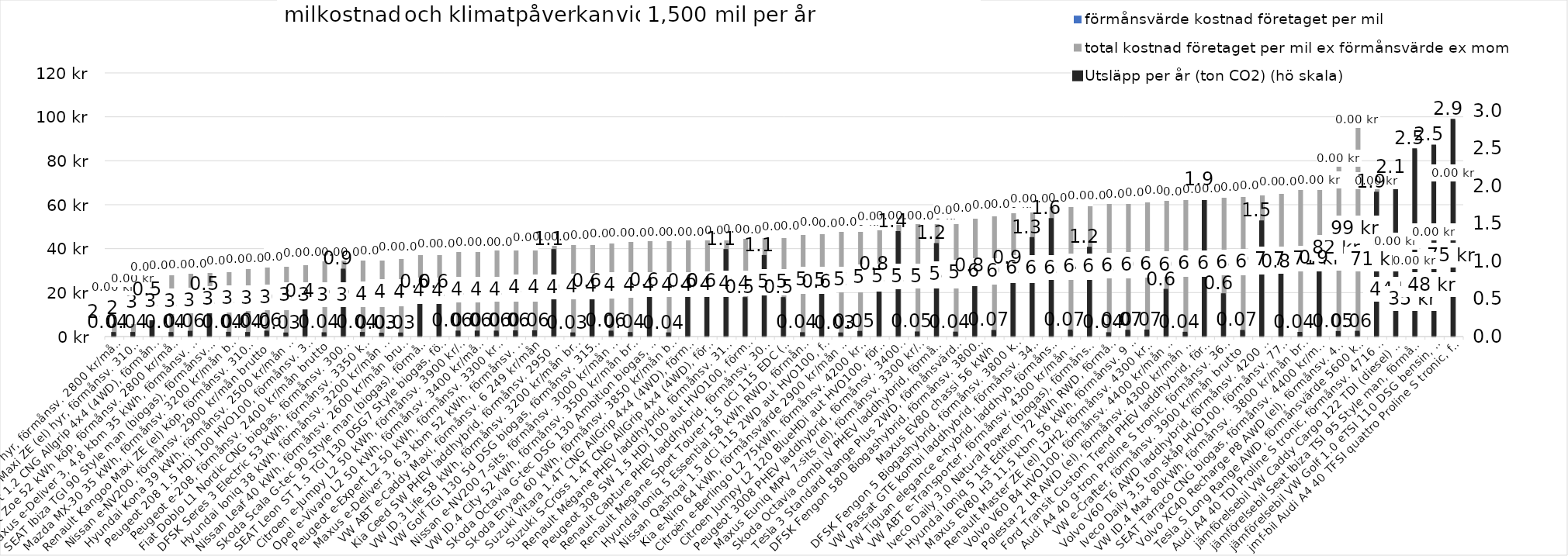
| Category | total kostnad företaget per mil ex förmånsvärde ex moms | förmånsvärde kostnad företaget per mil |
|---|---|---|
| Renault Zoe 52 kWh hyr, förmånsv. 2800 kr/mån brutto | 22.723 | 0 |
| Renault Kangoo Maxi ZE (el) hyr, förmånsv. 3100 kr/mån brutto  | 26.749 | 0 |
| Suzuki Swift 1.2 CNG Allgrip 4x4 (4WD), förmånsv. 2 700 kr/mån brutto  | 31.867 | 0 |
| Renault Zoe 52 kWh köp, förmånsv. 2800 kr/mån brutto | 32.723 | 0 |
| Maxus e-Deliver 3, 4,8 kbm 35 kWh, förmånsv. 2700 kr/mån brutto  | 33.007 | 0 |
| SEAT Ibiza TGI 90 Style man (biogas), förmånsv. 2500 kr/mån brutto | 33.365 | 0 |
| Mazda MX-30 35 kWh, förmånsv. 3200 kr/mån brutto | 34.881 | 0 |
| Renault Kangoo Maxi ZE (el) köp, förmånsv. 3100 kr/mån brutto  | 35.416 | 0 |
| Nissan e-NV200, förmånsv. 2900 kr/mån brutto  | 35.792 | 0 |
| Hyundai Kona 39 kWh, förmånsv. 2500 kr/mån brutto  | 36.353 | 0 |
| Peugeot 208 1.5 HDi 100 HVO100, förmånsv. 3000 kr/mån brutto | 38.459 | 0 |
| Peugeot e-208, förmånsv. 2400 kr/mån brutto | 38.538 | 0 |
| Fiat Doblo L1 Nordic CNG biogas, förmånsv. 3000 kr/mån brutto | 38.539 | 0 |
| DFSK Seres 3 Electric 53 kWh, förmånsv. 3350 kr/mån brutto  | 38.749 | 0 |
| Hyundai Ioniq 38 kWh, förmånsv. 3200 kr/mån brutto | 39.528 | 0 |
| Nissan Leaf 40 kWh, förmånsv. 2600 kr/mån brutto | 41.02 | 0 |
| Skoda Scala G-tec 90 Style man (biogas), förmånsv. 3000 kr/mån brutto | 41.083 | 0 |
| SEAT Leon ST 1.5 TGI 130 DSG7 Style biogas, förmånsv. 2900 kr/mån brutto | 42.48 | 0 |
| Citroen e-Jumpy L2 50 kWh, förmånsv. 3900 kr/mån brutto  | 42.485 | 0 |
| Opel e-Vivaro L2 50 kWh, förmånsv. 3400 kr/mån brutto  | 43.152 | 0 |
| Peugeot e-Expert L2 50 kWh, förmånsv. 3300 kr/mån brutto  | 43.152 | 0 |
| Maxus e-Deliver 3, 6,3 kbm 52 kWh, förmånsv. 2700 kr/mån brutto  | 43.337 | 0 |
| VW ABT e-Caddy Maxi, förmånsv. 6 249 kr/mån | 45.403 | 0 |
| Kia Ceed SW PHEV laddhybrid, förmånsv. 2950 kr/mån brutto | 45.79 | 0 |
| VW ID.3 Life 58 kWh, förmånsv. 3200 kr/mån brutto | 45.766 | 0 |
| VW Golf TGI 130 5d DSG biogas, förmånsv. 3150 kr/mån brutto | 46.544 | 0 |
| Nissan e-NV200 7-sits, förmånsv. 3000 kr/mån brutto | 47.125 | 0 |
| VW ID.4 City 52 kWh, förmånsv. 3500 kr/mån brutto | 47.35 | 0 |
| Skoda Octavia G-tec DSG 130 Ambition biogas, förmånsv. 3050 kr/mån brutto | 47.353 | 0 |
| Skoda Enyaq 60 kWh, förmånsv. 3850 kr/mån brutto | 47.779 | 0 |
| Suzuki Vitara 1.4T CNG AllGrip 4x4 (4WD), förmånsv. 3 055 kr/mån brutto  | 47.877 | 0 |
| Suzuki S-Cross 1.4T CNG AllGrip 4x4 (4WD), förmånsv. 3100 kr/mån brutto  | 47.949 | 0 |
| Renault Mégane PHEV laddhybrid, förmånsv. 3100 kr/mån brutto | 48.457 | 0 |
| Peugeot 308 SW 1.5 HDi 100 aut HVO100, förmånsv. 3500 kr/mån brutto | 49.064 | 0 |
| Renault Capture PHEV laddhybrid, förmånsv. 3000 kr/mån brutto | 48.906 | 0 |
| Renault Megane Sport Tourer 1.5 dCi 115 EDC (aut) HVO100, förmånsv. 3700 kr/mån brutto | 50.397 | 0 |
| Hyundai Ioniq 5 Essential 58 kWh RWD, förmånsv. ca 4000 kr/mån brutto  | 50.591 | 0 |
| Nissan Qashqai 1.5 dCi 115 2WD aut HVO100, förmånsv. 3800 kr/mån brutto | 52.26 | 0 |
| Kia e-Niro 64 kWh, förmånsvärde 2900 kr/mån brutto  | 51.739 | 0 |
| Citroën e-Berlingo L2 75kWh. förmånsv. 4200 kr/mån brutto  | 52.261 | 0 |
| Citroen Jumpy L2 120 BlueHDi aut HVO100, förmånsv. 5500 kr/mån brutto  | 54.981 | 0 |
| Peugeot 3008 PHEV laddhybrid, förmånsv. 3400 kr/mån brutto | 55.109 | 0 |
| Maxus Euniq MPV 7-sits (el), förmånsv. 3300 kr/mån brutto  | 55.145 | 0 |
| Skoda Octavia combi iV PHEV laddhybrid, förmånsv. 3400 kr/mån brutto | 55.341 | 0 |
| Tesla 3 Standard Range Plus 2WD, förmånsvärde 3600 kr/mån brutto | 57.68 | 0 |
| DFSK Fengon 580 Biogashybrid, förmånsv. 3800 kr/mån brutto | 58.901 | 0 |
| Maxus EV80 chassi 56 kWh | 60.333 | 0 |
| DFSK Fengon 5 Biogashybrid, förmånsv. 3800 kr/mån brutto | 60.475 | 0 |
| VW Passat GTE kombi laddhybrid, förmånsv. 3400 kr/mån brutto | 62.892 | 0 |
| VW Tiguan elegance e-hybrid, laddhyb, förmånsv. 3600 kr/mån brutto | 62.921 | 0 |
| VW ABT e-Transporter, förmånsv. 4300 kr/mån brutto  | 63.264 | 0 |
| Iveco Daily 3.0 Natural Power (biogas), förmånsv. 6400 kr/mån brutto | 64.462 | 0 |
| Hyundai Ioniq 5 1st Edition 72 kWh RWD, förmånsv. ca 4000 kr/mån brutto  | 64.578 | 0 |
| Maxus EV80 H3 11,5 kbm 56 kWh, förmånsv. 9 526 kr/mån | 65.132 | 0 |
| Renault Master ZE (el) L2H2, förmånsv. 4300 kr/mån brutto  | 65.97 | 0 |
| Volvo V60 B4 HVO100, förmånsv. 4400 kr/mån brutto  | 66.967 | 0 |
| Polestar 2 LR AWD (el), förmånsv. 4300 kr/mån brutto | 66.241 | 0 |
| Ford Transit Custom Trend PHEV laddhybrid, förmånsv. 3700 kr/mån brutto | 67.367 | 0 |
| Audi A4 40 g-tron Proline S tronic, förmånsv. 3692 kr/mån | 67.493 | 0 |
| VW e-Crafter, förmånsv. 3900 kr/mån brutto  | 68.333 | 0 |
| Volvo V60 T6 AWD laddhybrid, förmånsv. 4200 kr/mån brutto | 68.834 | 0 |
| Iveco Daily 3,5 ton skåp HVO100, förmånsv. 7707 kr/mån | 70.653 | 0 |
| VW ID.4 Max 80kWh, förmånsv.  3800 kr/mån brutto | 70.815 | 0 |
| SEAT Tarraco CNG biogas, förmånsv. 4400 kr/mån brutto | 71.348 | 0 |
| Volvo XC40 Recharge P8 AWD (el), förmånsv. 4000 kr/mån brutto | 81.528 | 0 |
| Tesla S Long Range AWD, förmånsvärde 5600 kr/mån brutto | 99.007 | 0 |
| Audi A4 40 TDI Proline S tronic, förmånsv. 4716 kr/mån | 70.974 | 0 |
| jämförelsebil VW Caddy Cargo 122 TDI (diesel) DSG, förmånsv. 4000 kr/mån brutto  | 43.615 | 0 |
| jämförelsebil Seat Ibiza TSI 95 Style man, förmånsv. 2772 kr/mån | 34.843 | 0 |
| jämförelsebil VW Golf 1.0 eTSI 110 DSG bensin, förmånsv. 3300 kr/mån brutto  | 47.654 | 0 |
| jmf-bil Audi A4 40 TFSI quattro Proline S tronic, förmånsv. 4823 kr/mån | 74.545 | 0 |